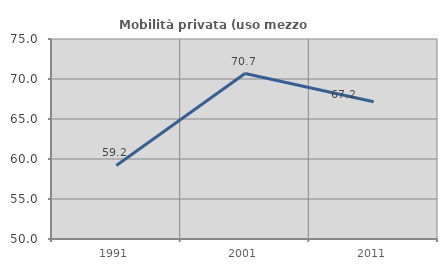
| Category | Mobilità privata (uso mezzo privato) |
|---|---|
| 1991.0 | 59.193 |
| 2001.0 | 70.68 |
| 2011.0 | 67.152 |